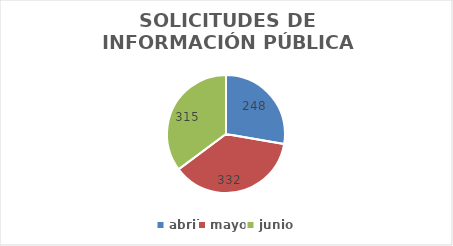
| Category | SOLICITUDES DE INFORMACIÓN PÚBLICA ATENDIDOS POR LA UAC |
|---|---|
| abril | 248 |
| mayo | 332 |
| junio | 315 |